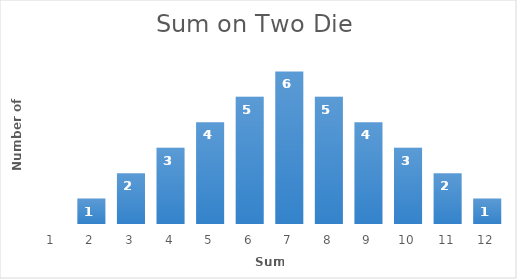
| Category | Series 0 |
|---|---|
| 0 | 0 |
| 1 | 1 |
| 2 | 2 |
| 3 | 3 |
| 4 | 4 |
| 5 | 5 |
| 6 | 6 |
| 7 | 5 |
| 8 | 4 |
| 9 | 3 |
| 10 | 2 |
| 11 | 1 |